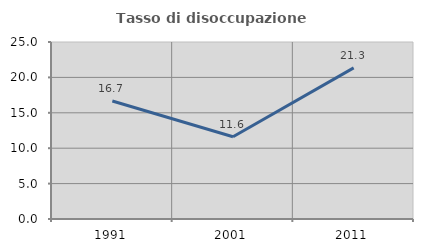
| Category | Tasso di disoccupazione giovanile  |
|---|---|
| 1991.0 | 16.667 |
| 2001.0 | 11.623 |
| 2011.0 | 21.346 |